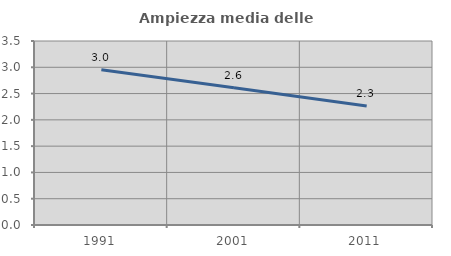
| Category | Ampiezza media delle famiglie |
|---|---|
| 1991.0 | 2.955 |
| 2001.0 | 2.612 |
| 2011.0 | 2.265 |